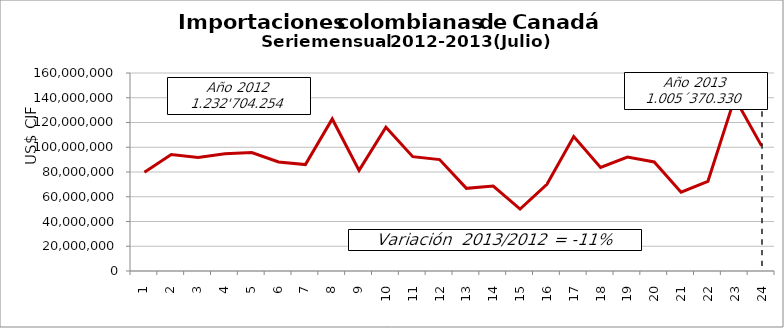
| Category | Series 0 |
|---|---|
| 0 | 79703444.85 |
| 1 | 94059145.59 |
| 2 | 91667153.43 |
| 3 | 94660816.39 |
| 4 | 95750531.98 |
| 5 | 88133099.84 |
| 6 | 85987982.16 |
| 7 | 122883395.02 |
| 8 | 81285411 |
| 9 | 116145769.5 |
| 10 | 92388686.42 |
| 11 | 90038817.7 |
| 12 | 66808679.1 |
| 13 | 68696108.95 |
| 14 | 50023272.55 |
| 15 | 70081775.44 |
| 16 | 108699245.96 |
| 17 | 83652247.63 |
| 18 | 92058514.68 |
| 19 | 88122837 |
| 20 | 63726171 |
| 21 | 72498993 |
| 22 | 139877881.8 |
| 23 | 101124603 |